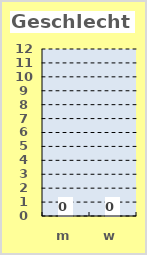
| Category | Series 0 |
|---|---|
| m | 0 |
| w | 0 |